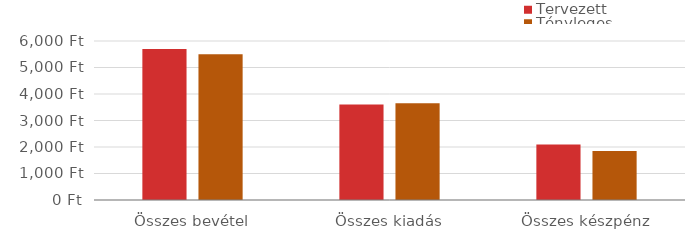
| Category | Tervezett | Tényleges |
|---|---|---|
| Összes bevétel | 5700 | 5500 |
| Összes kiadás | 3603 | 3655 |
| Összes készpénz | 2097 | 1845 |